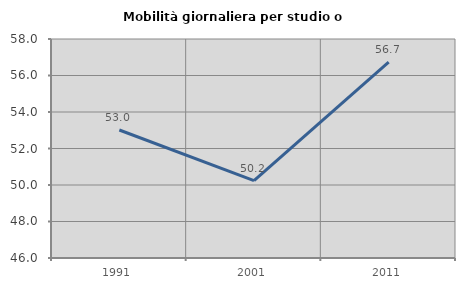
| Category | Mobilità giornaliera per studio o lavoro |
|---|---|
| 1991.0 | 53.013 |
| 2001.0 | 50.235 |
| 2011.0 | 56.738 |